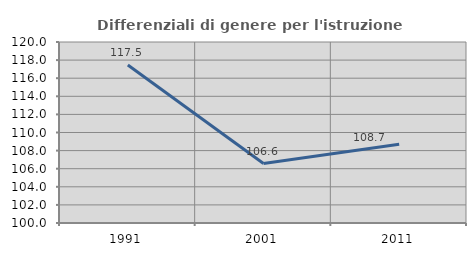
| Category | Differenziali di genere per l'istruzione superiore |
|---|---|
| 1991.0 | 117.455 |
| 2001.0 | 106.572 |
| 2011.0 | 108.712 |